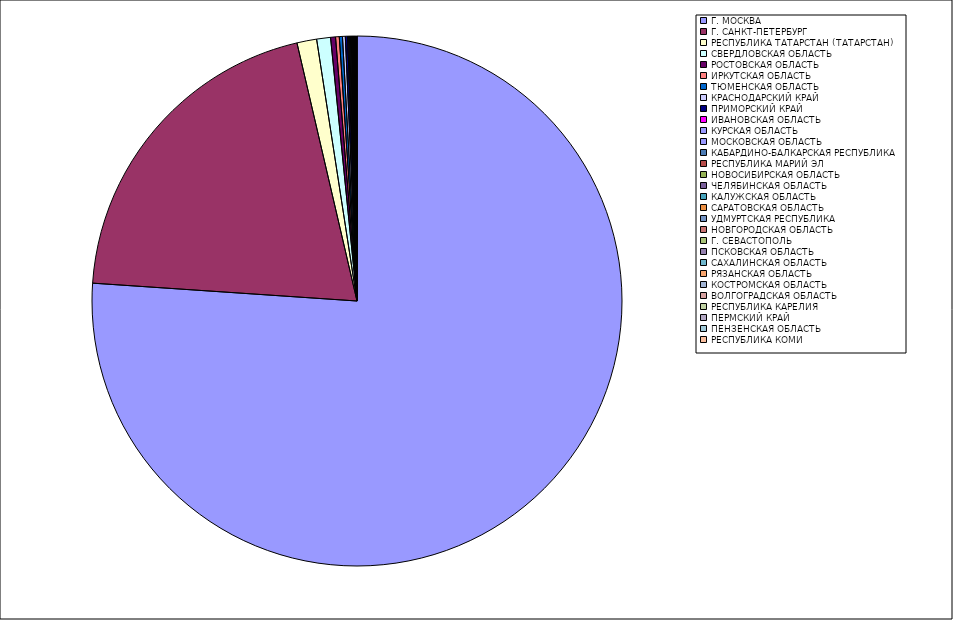
| Category | Оборот |
|---|---|
| Г. МОСКВА | 76.03 |
| Г. САНКТ-ПЕТЕРБУРГ | 20.277 |
| РЕСПУБЛИКА ТАТАРСТАН (ТАТАРСТАН) | 1.201 |
| СВЕРДЛОВСКАЯ ОБЛАСТЬ | 0.843 |
| РОСТОВСКАЯ ОБЛАСТЬ | 0.3 |
| ИРКУТСКАЯ ОБЛАСТЬ | 0.225 |
| ТЮМЕНСКАЯ ОБЛАСТЬ | 0.194 |
| КРАСНОДАРСКИЙ КРАЙ | 0.17 |
| ПРИМОРСКИЙ КРАЙ | 0.135 |
| ИВАНОВСКАЯ ОБЛАСТЬ | 0.062 |
| КУРСКАЯ ОБЛАСТЬ | 0.057 |
| МОСКОВСКАЯ ОБЛАСТЬ | 0.052 |
| КАБАРДИНО-БАЛКАРСКАЯ РЕСПУБЛИКА | 0.052 |
| РЕСПУБЛИКА МАРИЙ ЭЛ | 0.037 |
| НОВОСИБИРСКАЯ ОБЛАСТЬ | 0.036 |
| ЧЕЛЯБИНСКАЯ ОБЛАСТЬ | 0.036 |
| КАЛУЖСКАЯ ОБЛАСТЬ | 0.03 |
| САРАТОВСКАЯ ОБЛАСТЬ | 0.029 |
| УДМУРТСКАЯ РЕСПУБЛИКА | 0.029 |
| НОВГОРОДСКАЯ ОБЛАСТЬ | 0.024 |
| Г. СЕВАСТОПОЛЬ | 0.019 |
| ПСКОВСКАЯ ОБЛАСТЬ | 0.018 |
| САХАЛИНСКАЯ ОБЛАСТЬ | 0.014 |
| РЯЗАНСКАЯ ОБЛАСТЬ | 0.014 |
| КОСТРОМСКАЯ ОБЛАСТЬ | 0.013 |
| ВОЛГОГРАДСКАЯ ОБЛАСТЬ | 0.01 |
| РЕСПУБЛИКА КАРЕЛИЯ | 0.01 |
| ПЕРМСКИЙ КРАЙ | 0.009 |
| ПЕНЗЕНСКАЯ ОБЛАСТЬ | 0.009 |
| РЕСПУБЛИКА КОМИ | 0.008 |